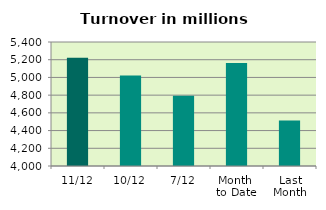
| Category | Series 0 |
|---|---|
| 11/12 | 5222.153 |
| 10/12 | 5022.749 |
| 7/12 | 4794.098 |
| Month 
to Date | 5163.327 |
| Last
Month | 4514.728 |